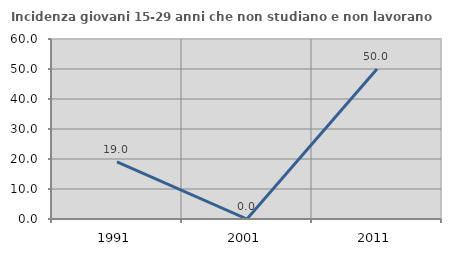
| Category | Incidenza giovani 15-29 anni che non studiano e non lavorano  |
|---|---|
| 1991.0 | 19.034 |
| 2001.0 | 0 |
| 2011.0 | 50 |